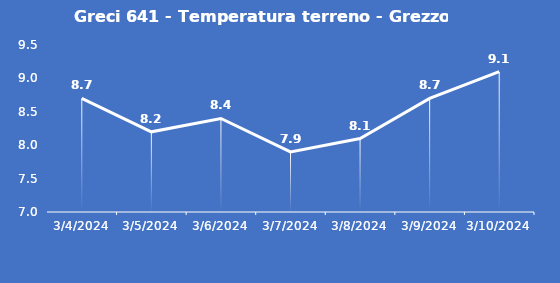
| Category | Greci 641 - Temperatura terreno - Grezzo (°C) |
|---|---|
| 3/4/24 | 8.7 |
| 3/5/24 | 8.2 |
| 3/6/24 | 8.4 |
| 3/7/24 | 7.9 |
| 3/8/24 | 8.1 |
| 3/9/24 | 8.7 |
| 3/10/24 | 9.1 |